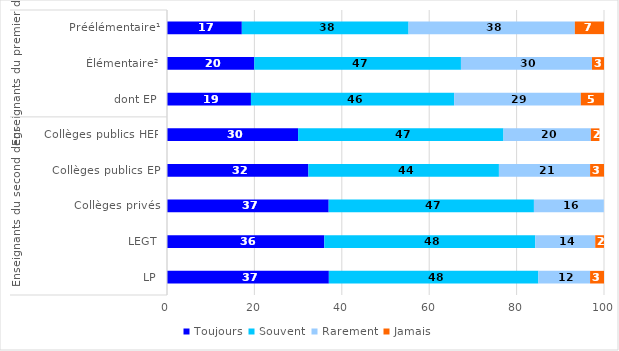
| Category | Toujours | Souvent | Rarement | Jamais |
|---|---|---|---|---|
| 0 | 17.123 | 38.154 | 38.053 | 6.67 |
| 1 | 19.973 | 47.292 | 29.982 | 2.752 |
| 2 | 19.211 | 46.496 | 28.991 | 5.303 |
| 3 | 30 | 47 | 20 | 1.949 |
| 4 | 32.358 | 43.598 | 20.866 | 3.178 |
| 5 | 37 | 46.965 | 16 | 0 |
| 6 | 35.994 | 48.282 | 13.721 | 2.003 |
| 7 | 37.038 | 47.946 | 11.829 | 3.187 |